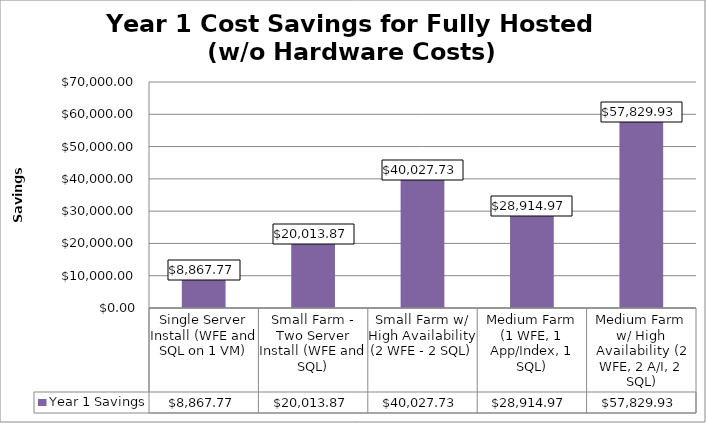
| Category | Year 1 Savings |
|---|---|
| Single Server Install (WFE and SQL on 1 VM) | 8867.767 |
| Small Farm - Two Server Install (WFE and SQL) | 20013.867 |
| Small Farm w/ High Availability (2 WFE - 2 SQL) | 40027.733 |
| Medium Farm (1 WFE, 1 App/Index, 1 SQL) | 28914.967 |
| Medium Farm w/ High Availability (2 WFE, 2 A/I, 2 SQL) | 57829.933 |